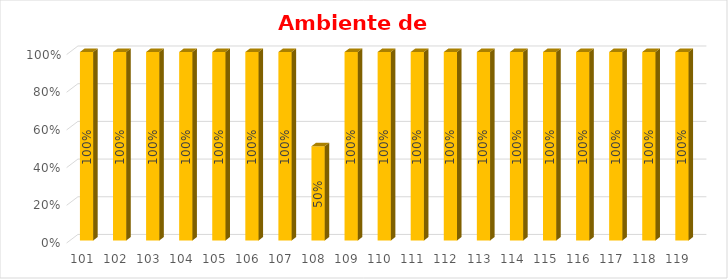
| Category | % Avance |
|---|---|
| 101.0 | 1 |
| 102.0 | 1 |
| 103.0 | 1 |
| 104.0 | 1 |
| 105.0 | 1 |
| 106.0 | 1 |
| 107.0 | 1 |
| 108.0 | 0.5 |
| 109.0 | 1 |
| 110.0 | 1 |
| 111.0 | 1 |
| 112.0 | 1 |
| 113.0 | 1 |
| 114.0 | 1 |
| 115.0 | 1 |
| 116.0 | 1 |
| 117.0 | 1 |
| 118.0 | 1 |
| 119.0 | 1 |